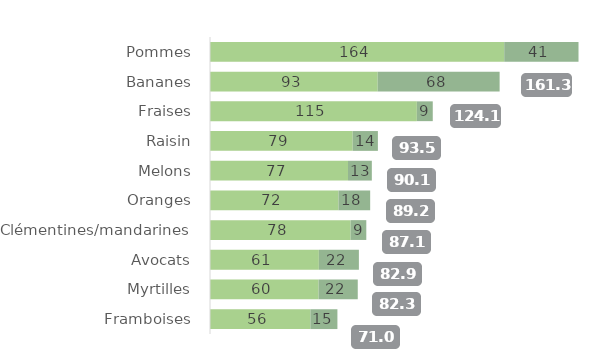
| Category | Non bio | Bio |
|---|---|---|
| Pommes | 163.865 | 41.381 |
| Bananes | 93.403 | 67.907 |
| Fraises | 115.209 | 8.858 |
| Raisin | 79.475 | 14.036 |
| Melons | 76.872 | 13.259 |
| Oranges | 71.553 | 17.662 |
| Clémentines/mandarines | 78.324 | 8.731 |
| Avocats | 60.63 | 22.292 |
| Myrtilles | 60.468 | 21.826 |
| Framboises | 55.898 | 15.067 |